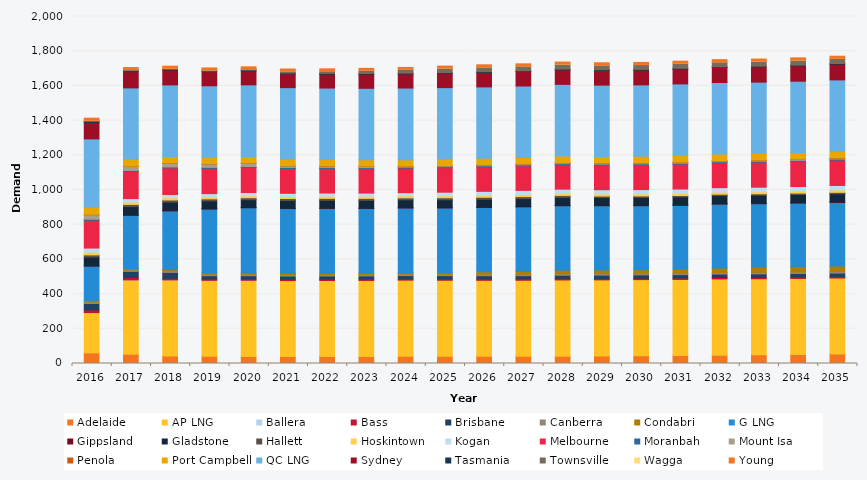
| Category | Adelaide | AP LNG | Ballera | Bass | Brisbane | Canberra | Condabri | G LNG | Gippsland | Gladstone | Hallett | Hoskintown | Kogan | Melbourne | Moranbah | Mount Isa | Penola | Port Campbell | QC LNG | Sydney | Tasmania | Townsville | Wagga | Young |
|---|---|---|---|---|---|---|---|---|---|---|---|---|---|---|---|---|---|---|---|---|---|---|---|---|
| 2016.0 | 61.21 | 232.174 | 0.008 | 15.569 | 36.923 | 8.563 | 9.23 | 198.09 | 0.569 | 50.707 | 13.1 | 15.503 | 23.732 | 159.75 | 6.453 | 25.541 | 2.544 | 42.303 | 392.601 | 94.64 | 6.3 | 6.355 | 0.103 | 11.985 |
| 2017.0 | 53.026 | 428.848 | 0.008 | 13.677 | 35.282 | 8.569 | 7.918 | 307.702 | 0.459 | 48.595 | 12.817 | 13.845 | 19.558 | 156.298 | 6.171 | 22.447 | 2.416 | 38.985 | 411.939 | 92.911 | 6.348 | 6.093 | 0.019 | 11.896 |
| 2018.0 | 43.815 | 437.977 | 0.016 | 9.289 | 33.893 | 8.477 | 7.344 | 338.406 | 3.91 | 46.706 | 12.562 | 13.365 | 18.346 | 152.808 | 5.918 | 20.947 | 2.349 | 37.662 | 411.939 | 85.818 | 4.447 | 5.898 | 0.047 | 11.724 |
| 2019.0 | 41.329 | 437.977 | 0.012 | 7.992 | 18.522 | 8.358 | 7.336 | 369.364 | 0.587 | 45.376 | 12.132 | 12.024 | 18.112 | 145.623 | 5.643 | 19.169 | 2.277 | 36.971 | 411.939 | 80.98 | 4.47 | 5.744 | 0.054 | 11.539 |
| 2020.0 | 40.43 | 439.149 | 0.007 | 7.91 | 18.296 | 8.246 | 7.396 | 376.402 | 0.847 | 45.239 | 11.698 | 11.843 | 17.932 | 144.571 | 5.759 | 18.057 | 2.267 | 36.985 | 413.042 | 80.606 | 4.484 | 7.111 | 0.106 | 11.458 |
| 2021.0 | 39.872 | 437.996 | 0 | 7.828 | 18.111 | 8.11 | 7.401 | 373.852 | 0.907 | 45.215 | 11.614 | 11.761 | 18.255 | 143.119 | 5.882 | 9.036 | 2.259 | 36.785 | 411.912 | 79.837 | 4.491 | 11.787 | 0.095 | 11.329 |
| 2022.0 | 40.383 | 438.025 | 0 | 7.795 | 18.13 | 8.044 | 7.631 | 373.852 | 0.945 | 45.365 | 11.607 | 12.207 | 18.546 | 141.643 | 6.022 | 6.631 | 2.27 | 36.628 | 411.868 | 79.969 | 4.493 | 14.868 | 0.299 | 11.282 |
| 2023.0 | 40.632 | 438.055 | 0 | 7.766 | 18.16 | 8.052 | 7.512 | 373.501 | 0.967 | 45.426 | 11.598 | 11.883 | 18.636 | 140.705 | 6.015 | 6.661 | 2.288 | 36.513 | 411.824 | 80.97 | 4.49 | 17.483 | 0.592 | 11.299 |
| 2024.0 | 41.256 | 439.257 | 0 | 7.823 | 18.342 | 8.117 | 7.277 | 374.502 | 1.051 | 45.567 | 11.614 | 12.155 | 17.727 | 140.982 | 6.024 | 3.96 | 2.292 | 36.921 | 412.882 | 81.428 | 4.482 | 20.925 | 0.573 | 11.376 |
| 2025.0 | 41.745 | 438.114 | 0 | 7.887 | 18.526 | 8.176 | 9.382 | 372.794 | 1.26 | 45.765 | 11.696 | 11.712 | 20.296 | 141.484 | 6.034 | 4.076 | 2.316 | 36.994 | 411.736 | 82.284 | 4.468 | 25.353 | 0.659 | 11.447 |
| 2026.0 | 41.264 | 438.144 | 0 | 7.918 | 18.642 | 8.234 | 14.414 | 370.693 | 1.328 | 45.865 | 11.641 | 11.863 | 22.231 | 141.022 | 6.033 | 4.119 | 2.303 | 36.919 | 411.692 | 82.896 | 4.451 | 27.524 | 0.775 | 11.515 |
| 2027.0 | 41.507 | 438.173 | 0 | 7.961 | 18.813 | 8.295 | 17.402 | 370.693 | 1.555 | 46.012 | 11.653 | 12.198 | 23.464 | 140.877 | 6.04 | 4.233 | 2.287 | 36.588 | 411.648 | 83.281 | 4.43 | 27.785 | 0.727 | 11.586 |
| 2028.0 | 42.189 | 439.375 | 0 | 8.015 | 18.983 | 8.362 | 20.44 | 371.686 | 1.731 | 46.173 | 11.621 | 11.959 | 24.177 | 141.117 | 6.047 | 4.339 | 2.296 | 37.591 | 412.706 | 83.778 | 4.405 | 28.111 | 0.69 | 11.662 |
| 2029.0 | 43.808 | 438.232 | 0 | 8.083 | 19.144 | 8.437 | 20.735 | 370.693 | 1.686 | 46.298 | 8.146 | 12.276 | 24.005 | 141.617 | 6.051 | 4.43 | 2.298 | 36.92 | 411.56 | 84.383 | 4.376 | 27.714 | 0.701 | 11.744 |
| 2030.0 | 45.099 | 438.262 | 0 | 8.156 | 19.306 | 8.513 | 20.351 | 369.723 | 1.65 | 46.457 | 8.181 | 11.826 | 24.845 | 142.168 | 6.055 | 4.519 | 2.294 | 36.945 | 411.517 | 84.797 | 4.344 | 27.973 | 0.527 | 11.827 |
| 2031.0 | 46.256 | 438.291 | 0 | 8.229 | 19.476 | 8.59 | 24.064 | 366.846 | 1.895 | 46.59 | 8.214 | 12.032 | 25.045 | 143.003 | 6.062 | 4.611 | 2.294 | 38.577 | 411.473 | 85.673 | 4.311 | 28.219 | 0.681 | 11.911 |
| 2032.0 | 47.878 | 439.494 | 0 | 8.291 | 19.643 | 8.665 | 26.921 | 367.828 | 2.087 | 46.751 | 8.224 | 11.912 | 25.74 | 143.452 | 6.068 | 4.702 | 2.299 | 37.059 | 412.53 | 86.481 | 4.276 | 28.299 | 0.814 | 11.993 |
| 2033.0 | 49.93 | 438.351 | 0 | 8.357 | 19.803 | 8.741 | 28.878 | 366.846 | 2.246 | 46.893 | 8.202 | 12.289 | 25.568 | 143.992 | 6.073 | 4.791 | 2.231 | 37.156 | 411.385 | 87.528 | 4.241 | 28.4 | 0.785 | 12.075 |
| 2034.0 | 51.863 | 438.38 | 0 | 8.423 | 19.964 | 8.814 | 30.433 | 366.846 | 2.1 | 47.033 | 8.204 | 12.34 | 25.91 | 144.585 | 6.091 | 4.879 | 2.234 | 37.729 | 411.341 | 88.528 | 4.206 | 28.583 | 0.847 | 12.155 |
| 2035.0 | 54.264 | 438.41 | 0 | 8.487 | 20.121 | 8.889 | 31.408 | 366.846 | 2.669 | 47.167 | 8.218 | 13.697 | 25.994 | 145.802 | 6.108 | 4.966 | 2.35 | 38.363 | 410.891 | 90.377 | 4.169 | 28.756 | 0.954 | 12.237 |